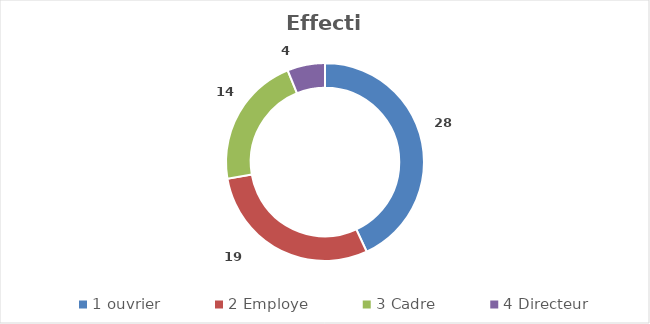
| Category | Effectif |
|---|---|
| 1 ouvrier | 28 |
| 2 Employe | 19 |
| 3 Cadre | 14 |
| 4 Directeur | 4 |